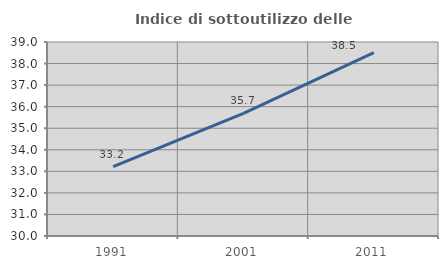
| Category | Indice di sottoutilizzo delle abitazioni  |
|---|---|
| 1991.0 | 33.22 |
| 2001.0 | 35.692 |
| 2011.0 | 38.506 |